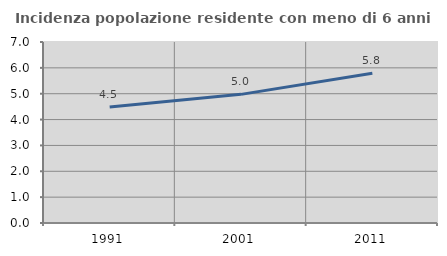
| Category | Incidenza popolazione residente con meno di 6 anni |
|---|---|
| 1991.0 | 4.488 |
| 2001.0 | 4.975 |
| 2011.0 | 5.787 |